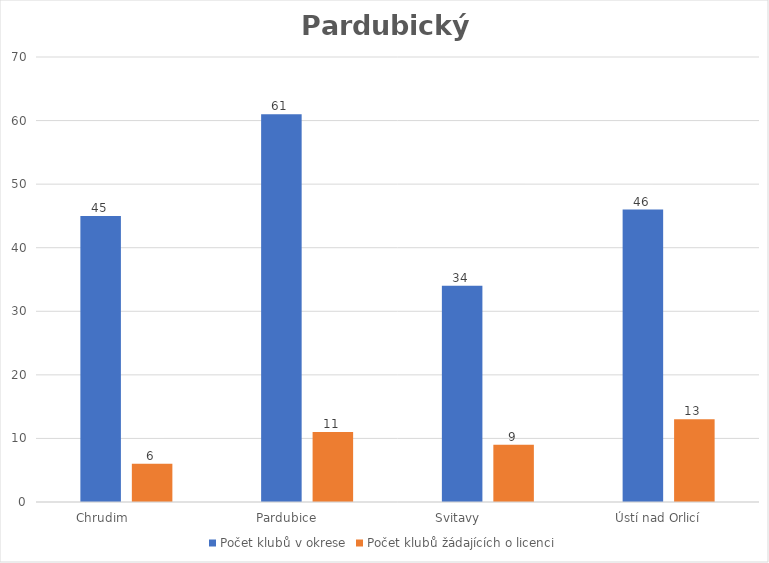
| Category | Počet klubů v okrese | Počet klubů žádajících o licenci |
|---|---|---|
| Chrudim             | 45 | 6 |
| Pardubice           | 61 | 11 |
| Svitavy                | 34 | 9 |
| Ústí nad Orlicí      | 46 | 13 |